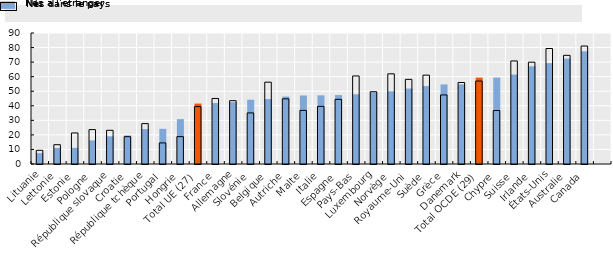
| Category | Nés à l’étranger | Nés dans le pays |
|---|---|---|
| Lituanie | 7.458 | 9.409 |
| Lettonie | 10.973 | 13.258 |
| Estonie | 11.089 | 21.328 |
| Pologne | 16.218 | 23.633 |
| République slovaque | 19.008 | 23.153 |
| Croatie | 19.648 | 18.76 |
| République tchèque | 23.996 | 27.744 |
| Portugal | 24.177 | 14.492 |
| Hongrie | 30.826 | 18.787 |
| Total UE (27) | 41.525 | 39.425 |
| France | 41.862 | 45.031 |
| Allemagne | 42.487 | 43.507 |
| Slovénie | 44.157 | 35.093 |
| Belgique | 44.616 | 56.197 |
| Autriche | 46.356 | 44.782 |
| Malte | 47.065 | 36.827 |
| Italie | 47.178 | 39.594 |
| Espagne | 47.356 | 44.414 |
| Pays-Bas | 47.883 | 60.481 |
| Luxembourg | 49.16 | 49.649 |
| Norvège | 49.923 | 61.951 |
| Royaume-Uni | 51.872 | 58.154 |
| Suède | 53.548 | 61.044 |
| Grèce | 54.679 | 47.44 |
| Danemark | 54.706 | 55.999 |
| Total OCDE (29) | 59.337 | 56.998 |
| Chypre | 59.367 | 36.743 |
| Suisse | 61.47 | 70.794 |
| Irlande | 67.115 | 69.947 |
| États-Unis | 69.317 | 79.346 |
| Australie | 72.413 | 74.654 |
| Canada | 77.41 | 81.03 |